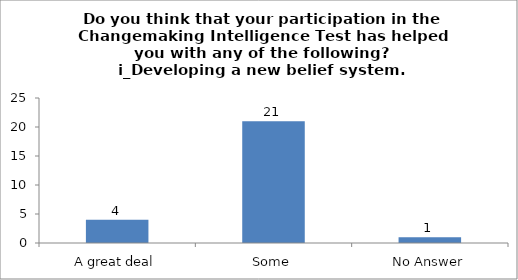
| Category | Do you think that your participation in the Changemaking Intelligence Test has helped you with any of the following?
i_Developing a new belief system. |
|---|---|
| A great deal | 4 |
| Some | 21 |
| No Answer | 1 |